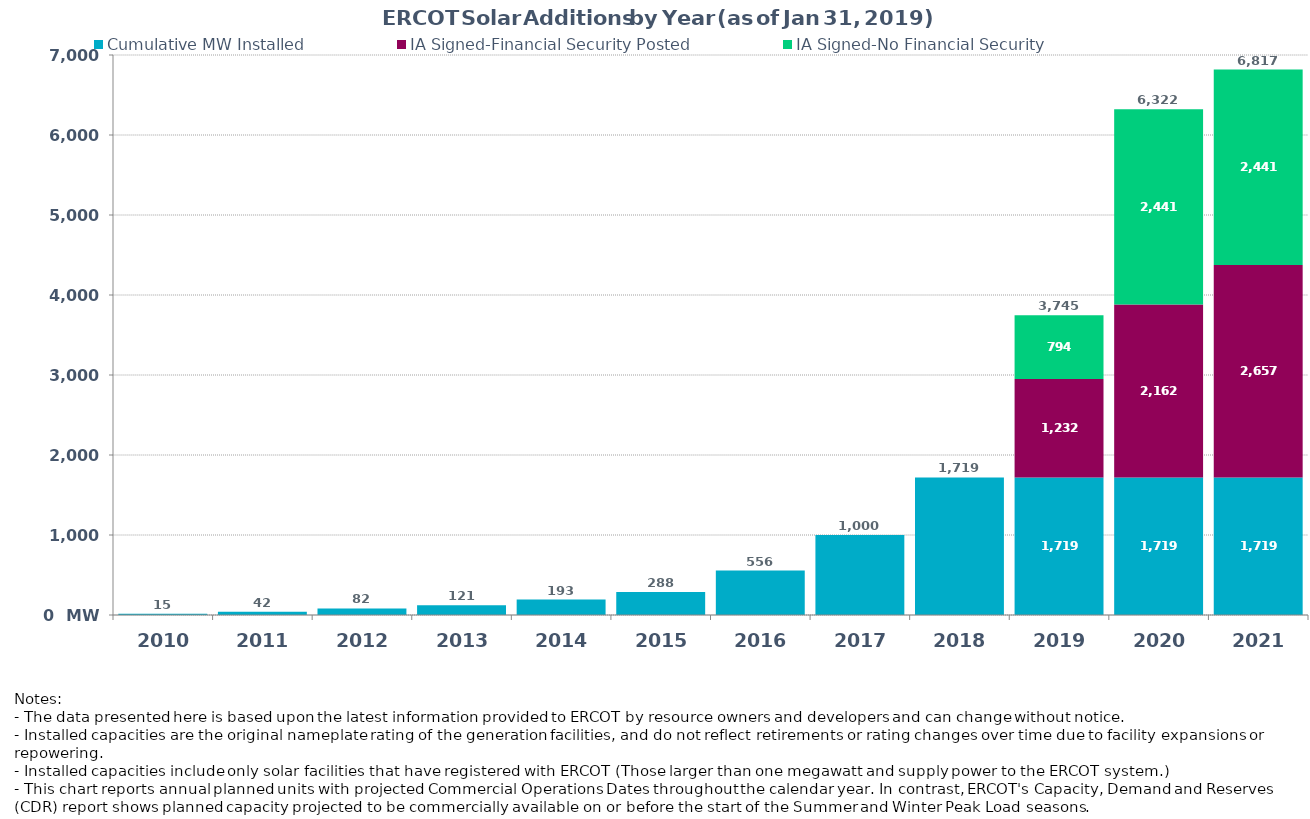
| Category | Cumulative MW Installed | IA Signed-Financial Security Posted  | IA Signed-No Financial Security  | Cumulative Installed and Planned |
|---|---|---|---|---|
| 2010.0 | 15 | 0 | 0 | 15 |
| 2011.0 | 42 | 0 | 0 | 42 |
| 2012.0 | 82 | 0 | 0 | 82 |
| 2013.0 | 121 | 0 | 0 | 121 |
| 2014.0 | 193 | 0 | 0 | 193 |
| 2015.0 | 287.7 | 0 | 0 | 287.7 |
| 2016.0 | 556 | 0 | 0 | 556 |
| 2017.0 | 1000 | 0 | 0 | 1000 |
| 2018.0 | 1719 | 0 | 0 | 1719 |
| 2019.0 | 1719 | 1232.4 | 794 | 3745.4 |
| 2020.0 | 1719 | 2161.96 | 2441.3 | 6322.26 |
| 2021.0 | 1719 | 2656.96 | 2441.3 | 6817.26 |